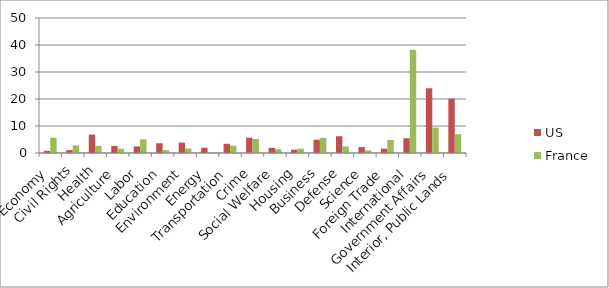
| Category | US | France |
|---|---|---|
| Economy | 0.829 | 5.654 |
| Civil Rights | 1.079 | 2.8 |
| Health | 6.821 | 2.639 |
| Agriculture | 2.601 | 1.562 |
| Labor | 2.447 | 5.062 |
| Education | 3.603 | 1.077 |
| Environment | 3.854 | 1.669 |
| Energy | 1.965 | 0.269 |
| Transportation | 3.41 | 2.693 |
| Crime | 5.665 | 5.17 |
| Social Welfare | 1.888 | 1.4 |
| Housing | 1.233 | 1.616 |
| Business | 4.933 | 5.6 |
| Defense | 6.224 | 2.423 |
| Science | 2.197 | 0.969 |
| Foreign Trade | 1.638 | 4.847 |
| International | 5.453 | 38.18 |
| Government Affairs | 23.988 | 9.424 |
| Interior, Public Lands | 20.154 | 6.947 |